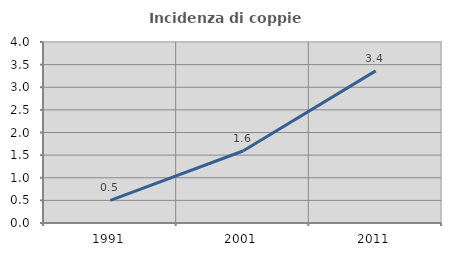
| Category | Incidenza di coppie miste |
|---|---|
| 1991.0 | 0.5 |
| 2001.0 | 1.591 |
| 2011.0 | 3.361 |